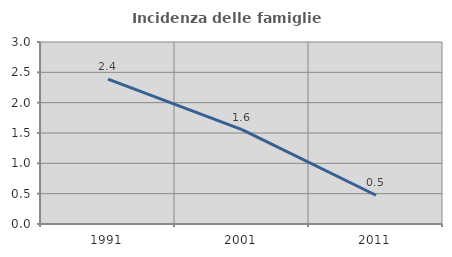
| Category | Incidenza delle famiglie numerose |
|---|---|
| 1991.0 | 2.389 |
| 2001.0 | 1.556 |
| 2011.0 | 0.474 |